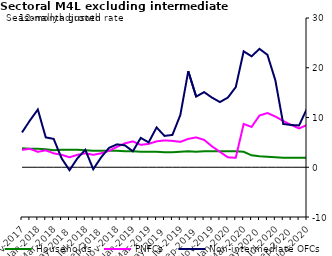
| Category | zero | Households | PNFCs | Non-intermediate OFCs |
|---|---|---|---|---|
| Nov-2017 | 0 | 3.8 | 3.5 | 7 |
| Dec-2017 | 0 | 3.7 | 3.7 | 9.4 |
| Jan-2018 | 0 | 3.7 | 3.1 | 11.6 |
| Feb-2018 | 0 | 3.6 | 3.4 | 6 |
| Mar-2018 | 0 | 3.4 | 2.8 | 5.7 |
| Apr-2018 | 0 | 3.5 | 2.5 | 1.8 |
| May-2018 | 0 | 3.5 | 2 | -0.6 |
| Jun-2018 | 0 | 3.5 | 2.5 | 1.8 |
| Jul-2018 | 0 | 3.4 | 2.8 | 3.5 |
| Aug-2018 | 0 | 3.3 | 2.5 | -0.4 |
| Sep-2018 | 0 | 3.3 | 2.8 | 2 |
| Oct-2018 | 0 | 3.3 | 3.3 | 3.9 |
| Nov-2018 | 0 | 3.3 | 4.1 | 4.6 |
| Dec-2018 | 0 | 3.2 | 4.8 | 4.4 |
| Jan-2019 | 0 | 3.2 | 5.2 | 3.2 |
| Feb-2019 | 0 | 3.1 | 4.5 | 5.9 |
| Mar-2019 | 0 | 3.1 | 4.7 | 5 |
| Apr-2019 | 0 | 3.1 | 5.2 | 8 |
| May-2019 | 0 | 3 | 5.4 | 6.3 |
| Jun-2019 | 0 | 3 | 5.3 | 6.5 |
| Jul-2019 | 0 | 3.1 | 5.1 | 10.5 |
| Aug-2019 | 0 | 3.2 | 5.7 | 19.3 |
| Sep-2019 | 0 | 3.1 | 6 | 14.2 |
| Oct-2019 | 0 | 3.2 | 5.5 | 15.1 |
| Nov-2019 | 0 | 3.2 | 4.2 | 14 |
| Dec-2019 | 0 | 3.2 | 3.1 | 13.1 |
| Jan-2020 | 0 | 3.2 | 2 | 14 |
| Feb-2020 | 0 | 3.2 | 1.9 | 16.1 |
| Mar-2020 | 0 | 3.1 | 8.7 | 23.3 |
| Apr-2020 | 0 | 2.4 | 8.1 | 22.3 |
| May-2020 | 0 | 2.2 | 10.4 | 23.8 |
| Jun-2020 | 0 | 2.1 | 10.9 | 22.6 |
| Jul-2020 | 0 | 2 | 10.2 | 17.5 |
| Aug-2020 | 0 | 1.9 | 9.3 | 8.7 |
| Sep-2020 | 0 | 1.9 | 8.5 | 8.5 |
| Oct-2020 | 0 | 1.9 | 7.8 | 8.4 |
| Nov-2020 | 0 | 1.9 | 8.5 | 11.8 |